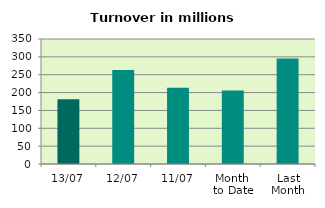
| Category | Series 0 |
|---|---|
| 13/07 | 181.369 |
| 12/07 | 263.437 |
| 11/07 | 213.54 |
| Month 
to Date | 206.129 |
| Last
Month | 295.453 |